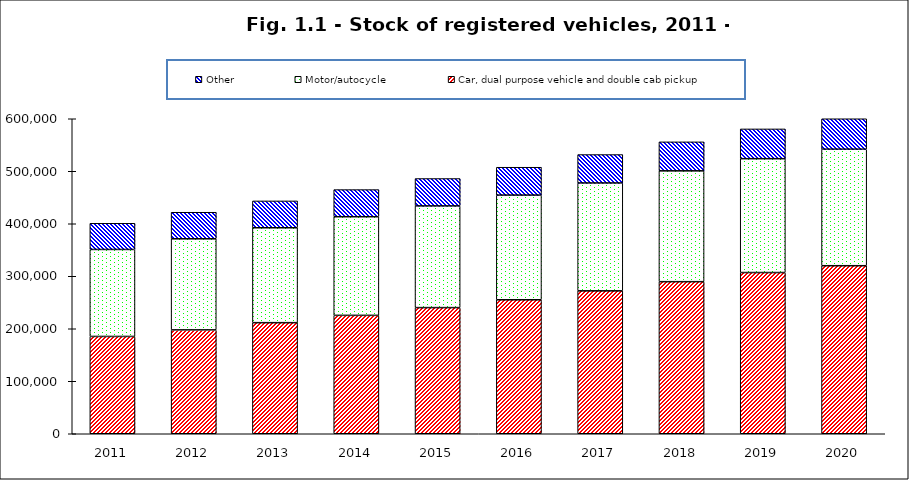
| Category | Car, dual purpose vehicle and double cab pickup | Motor/autocycle | Other |
|---|---|---|---|
| 2011.0 | 185357 | 165706 | 49856 |
| 2012.0 | 197849 | 173508 | 50569 |
| 2013.0 | 211586 | 180785 | 51124 |
| 2014.0 | 225522 | 187851 | 51679 |
| 2015.0 | 240289 | 193688 | 52167 |
| 2016.0 | 255199 | 199399 | 53078 |
| 2017.0 | 272213 | 205493 | 54091 |
| 2018.0 | 289676 | 211125 | 55200 |
| 2019.0 | 307081 | 216863 | 56685 |
| 2020.0 | 320064 | 221988 | 58001 |